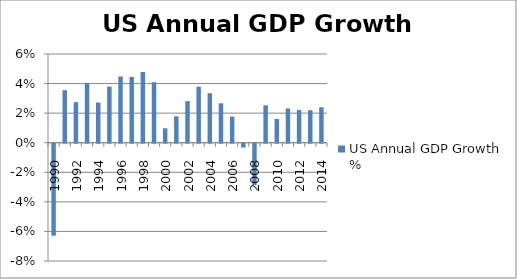
| Category | US Annual GDP Growth % |
|---|---|
| 1990 | -0.062 |
| 1991 | 0.036 |
| 1992 | 0.027 |
| 1993 | 0.04 |
| 1994 | 0.027 |
| 1995 | 0.038 |
| 1996 | 0.045 |
| 1997 | 0.045 |
| 1998 | 0.048 |
| 1999 | 0.041 |
| 2000 | 0.01 |
| 2001 | 0.018 |
| 2002 | 0.028 |
| 2003 | 0.038 |
| 2004 | 0.033 |
| 2005 | 0.027 |
| 2006 | 0.018 |
| 2007 | -0.003 |
| 2008 | -0.028 |
| 2009 | 0.025 |
| 2010 | 0.016 |
| 2011 | 0.023 |
| 2012 | 0.022 |
| 2013 | 0.022 |
| 2014 | 0.024 |